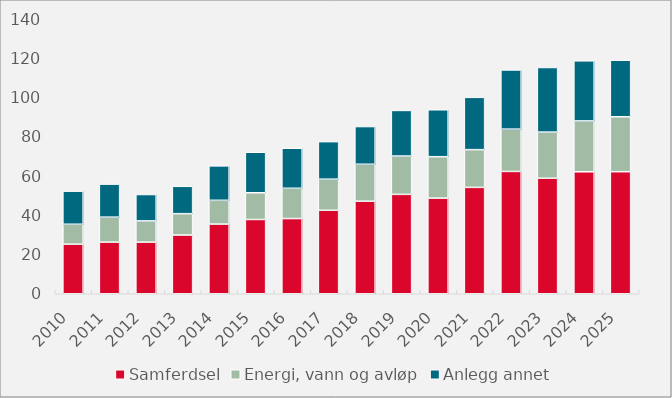
| Category | Samferdsel | Energi, vann og avløp | Anlegg annet |
|---|---|---|---|
| 2010.0 | 25.245 | 10.134 | 16.854 |
| 2011.0 | 26.285 | 12.708 | 16.838 |
| 2012.0 | 26.277 | 10.816 | 13.423 |
| 2013.0 | 29.907 | 10.863 | 13.922 |
| 2014.0 | 35.467 | 12.103 | 17.542 |
| 2015.0 | 37.823 | 13.591 | 20.616 |
| 2016.0 | 38.28 | 15.421 | 20.367 |
| 2017.0 | 42.496 | 15.842 | 19.101 |
| 2018.0 | 47.119 | 18.802 | 19.2 |
| 2019.0 | 50.591 | 19.516 | 23.221 |
| 2020.0 | 48.686 | 21.086 | 23.895 |
| 2021.0 | 54.155 | 19.204 | 26.626 |
| 2022.0 | 62.274 | 21.532 | 30.14 |
| 2023.0 | 58.81 | 23.492 | 32.881 |
| 2024.0 | 62.098 | 25.885 | 30.597 |
| 2025.0 | 62.144 | 27.955 | 28.8 |